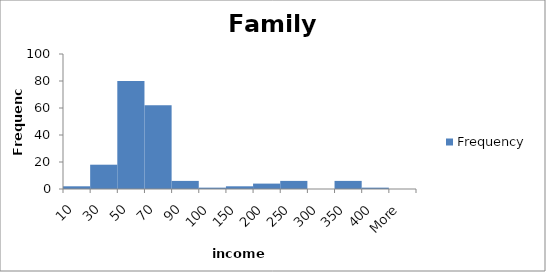
| Category | Frequency |
|---|---|
| 10 | 2 |
| 30 | 18 |
| 50 | 80 |
| 70 | 62 |
| 90 | 6 |
| 100 | 1 |
| 150 | 2 |
| 200 | 4 |
| 250 | 6 |
| 300 | 0 |
| 350 | 6 |
| 400 | 1 |
| More | 0 |